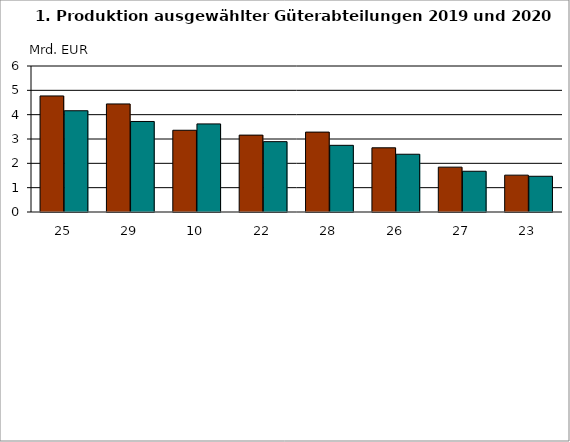
| Category | Series 0 | Series 1 |
|---|---|---|
| 25.0 | 4.769 | 4.161 |
| 29.0 | 4.441 | 3.72 |
| 10.0 | 3.359 | 3.62 |
| 22.0 | 3.159 | 2.891 |
| 28.0 | 3.283 | 2.74 |
| 26.0 | 2.638 | 2.374 |
| 27.0 | 1.843 | 1.674 |
| 23.0 | 1.514 | 1.468 |